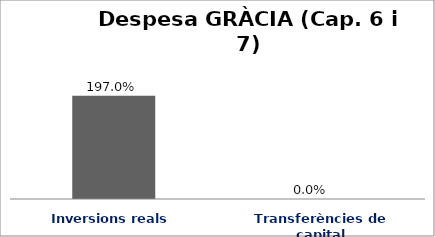
| Category | Series 0 |
|---|---|
| Inversions reals | 1.97 |
| Transferències de capital | 0 |